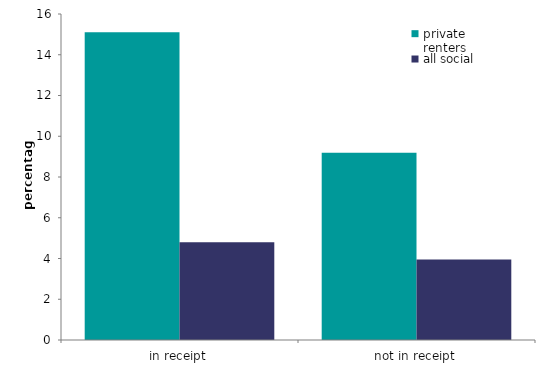
| Category | private
renters | all social
renters |
|---|---|---|
| in receipt | 15.102 | 4.793 |
| not in receipt | 9.196 | 3.946 |